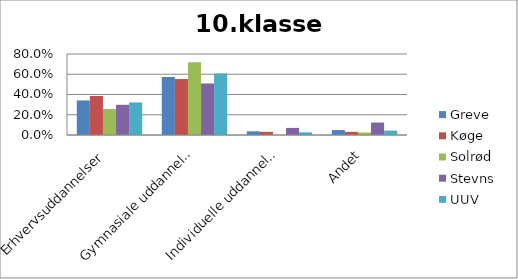
| Category | Greve | Køge | Solrød | Stevns | UUV |
|---|---|---|---|---|---|
| Erhvervsuddannelser | 0.341 | 0.385 | 0.256 | 0.298 | 0.322 |
| Gymnasiale uddannelser | 0.573 | 0.553 | 0.719 | 0.509 | 0.609 |
| Individuelle uddannelser | 0.037 | 0.031 | 0 | 0.07 | 0.026 |
| Andet | 0.049 | 0.031 | 0.025 | 0.123 | 0.043 |